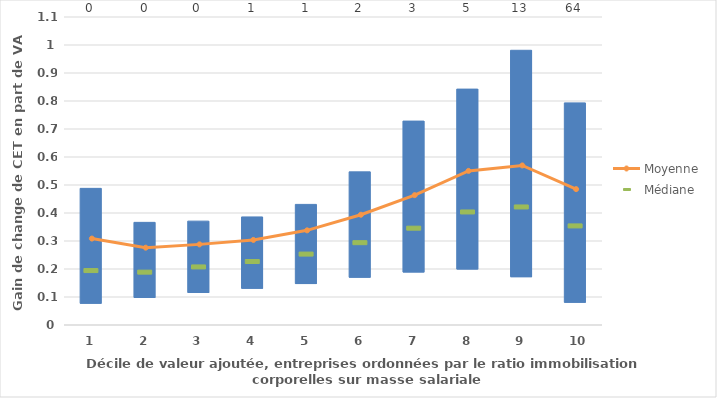
| Category | lower | upper |
|---|---|---|
| 1.0 | 0.076 | 0.412 |
| 2.0 | 0.097 | 0.27 |
| 3.0 | 0.114 | 0.257 |
| 4.0 | 0.129 | 0.257 |
| 5.0 | 0.146 | 0.285 |
| 6.0 | 0.169 | 0.378 |
| 7.0 | 0.188 | 0.541 |
| 8.0 | 0.198 | 0.644 |
| 9.0 | 0.171 | 0.81 |
| 10.0 | 0.079 | 0.714 |